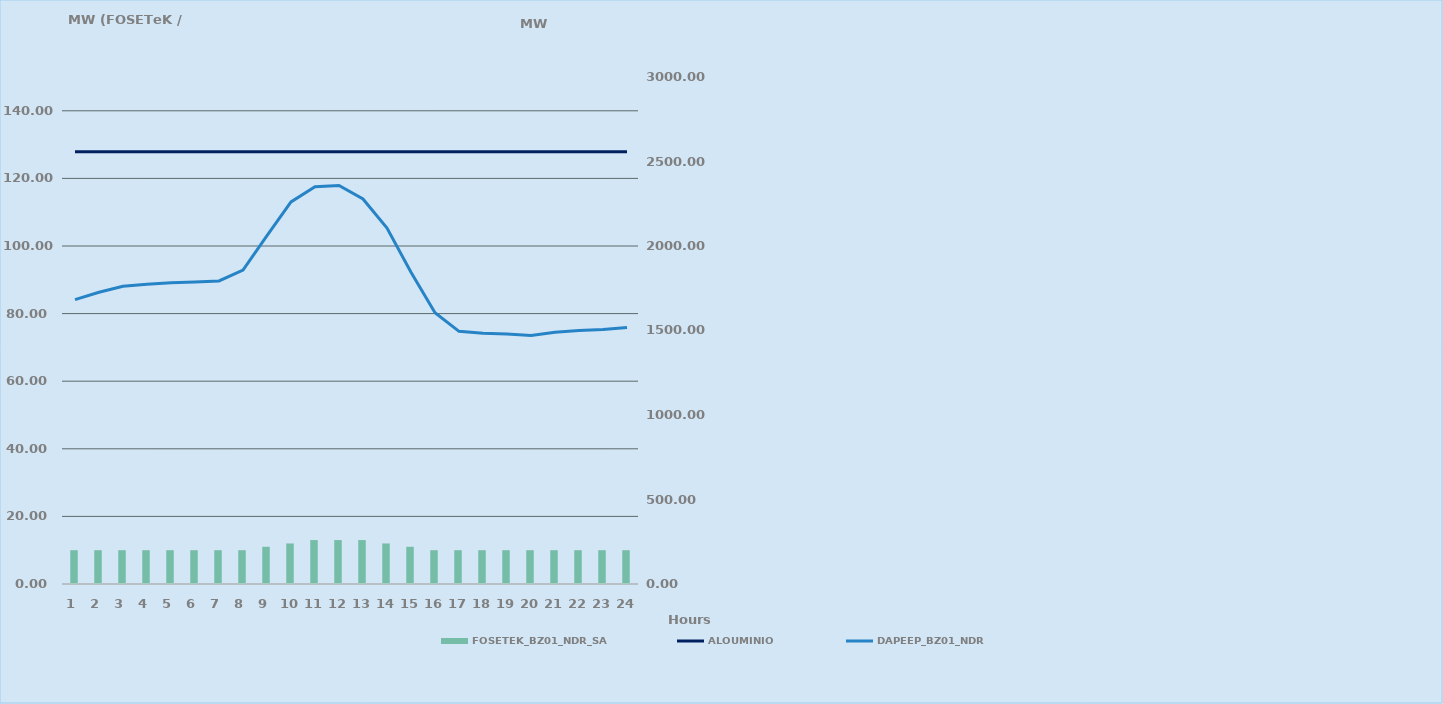
| Category | FOSETEK_BZ01_NDR_SA |
|---|---|
| 0 | 10 |
| 1 | 10 |
| 2 | 10 |
| 3 | 10 |
| 4 | 10 |
| 5 | 10 |
| 6 | 10 |
| 7 | 10 |
| 8 | 11 |
| 9 | 12 |
| 10 | 13 |
| 11 | 13 |
| 12 | 13 |
| 13 | 12 |
| 14 | 11 |
| 15 | 10 |
| 16 | 10 |
| 17 | 10 |
| 18 | 10 |
| 19 | 10 |
| 20 | 10 |
| 21 | 10 |
| 22 | 10 |
| 23 | 10 |